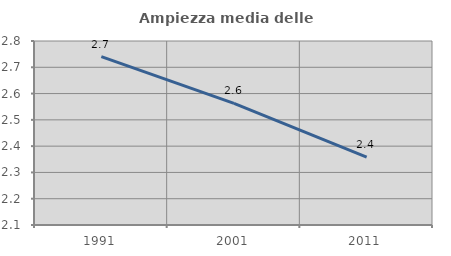
| Category | Ampiezza media delle famiglie |
|---|---|
| 1991.0 | 2.741 |
| 2001.0 | 2.562 |
| 2011.0 | 2.358 |